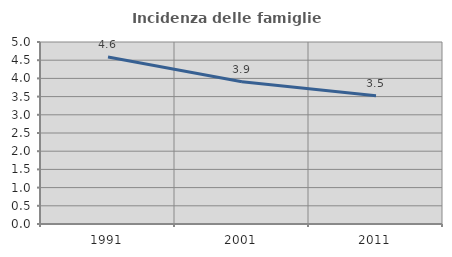
| Category | Incidenza delle famiglie numerose |
|---|---|
| 1991.0 | 4.589 |
| 2001.0 | 3.907 |
| 2011.0 | 3.525 |